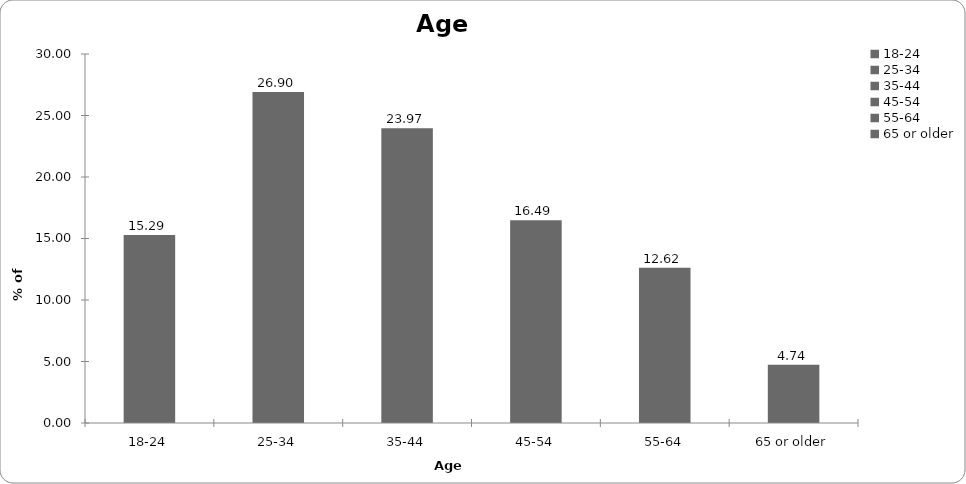
| Category | Age range |
|---|---|
| 18-24 | 15.287 |
| 25-34 | 26.903 |
| 35-44 | 23.965 |
| 45-54 | 16.489 |
| 55-64 | 12.617 |
| 65 or older | 4.74 |